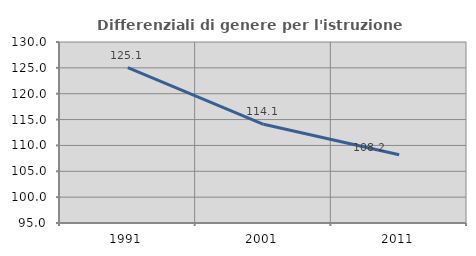
| Category | Differenziali di genere per l'istruzione superiore |
|---|---|
| 1991.0 | 125.058 |
| 2001.0 | 114.091 |
| 2011.0 | 108.206 |